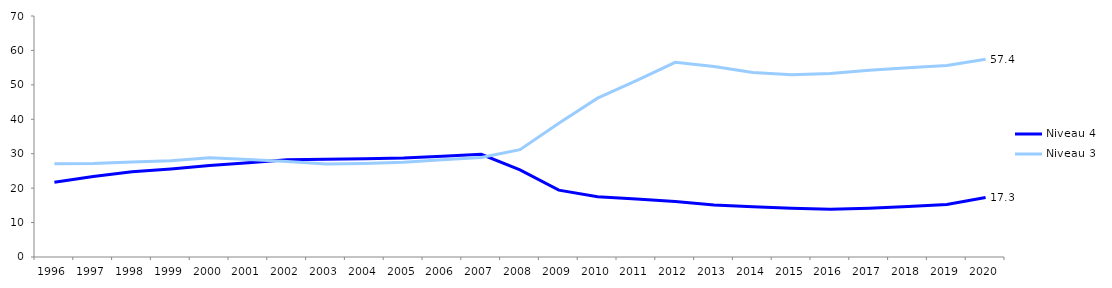
| Category | Niveau 4 | Niveau 3 |
|---|---|---|
| 1996 | 21.718 | 27.088 |
| 1997 | 23.41 | 27.192 |
| 1998 | 24.79 | 27.591 |
| 1999 | 25.546 | 27.963 |
| 2000 | 26.55 | 28.797 |
| 2001 | 27.405 | 28.326 |
| 2002 | 28.216 | 27.76 |
| 2003 | 28.389 | 27.016 |
| 2004 | 28.536 | 27.186 |
| 2005 | 28.732 | 27.507 |
| 2006 | 29.298 | 28.268 |
| 2007 | 29.822 | 28.911 |
| 2008 | 25.292 | 31.184 |
| 2009 | 19.423 | 38.864 |
| 2010 | 17.504 | 46.14 |
| 2011 | 16.812 | 51.224 |
| 2012 | 16.103 | 56.535 |
| 2013 | 15.137 | 55.313 |
| 2014 | 14.583 | 53.621 |
| 2015 | 14.13 | 52.964 |
| 2016 | 13.901 | 53.313 |
| 2017 | 14.164 | 54.267 |
| 2018 | 14.662 | 54.936 |
| 2019 | 15.238 | 55.652 |
| 2020 | 17.3 | 57.446 |